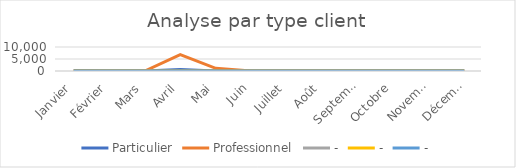
| Category | Particulier | Professionnel | - |
|---|---|---|---|
| Janvier | 258 | 0 | 0 |
| Février | 0 | 0 | 0 |
| Mars | 0 | 0 | 0 |
| Avril | 612 | 6807 | 0 |
| Mai | 0 | 1102 | 0 |
| Juin | 0 | 0 | 0 |
| Juillet | 0 | 0 | 0 |
| Août | 0 | 0 | 0 |
| Septembre | 0 | 0 | 0 |
| Octobre | 0 | 0 | 0 |
| Novembre | 0 | 0 | 0 |
| Décembre | 0 | 0 | 0 |